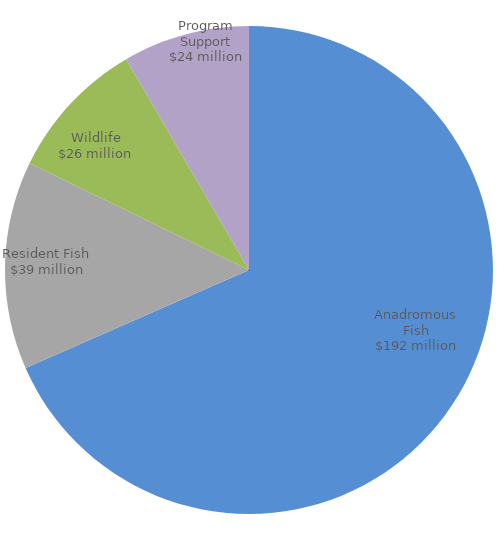
| Category | Series 0 |
|---|---|
| Anadromous Fish | 192087398 |
| Resident Fish | 38701513 |
| Wildlife | 26374872 |
| Program Support | 23583701 |